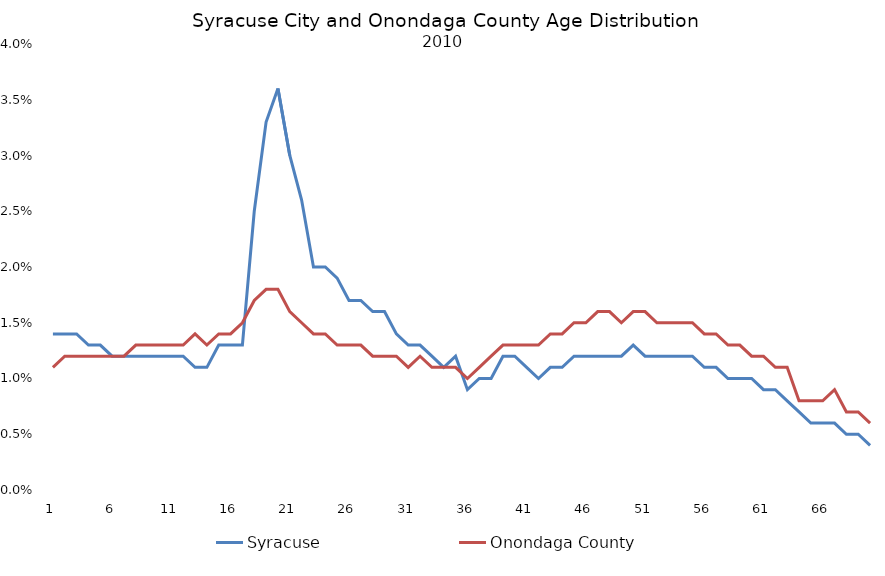
| Category | Syracuse | Onondaga County |
|---|---|---|
| 0 | 0.014 | 0.011 |
| 1 | 0.014 | 0.012 |
| 2 | 0.014 | 0.012 |
| 3 | 0.013 | 0.012 |
| 4 | 0.013 | 0.012 |
| 5 | 0.012 | 0.012 |
| 6 | 0.012 | 0.012 |
| 7 | 0.012 | 0.013 |
| 8 | 0.012 | 0.013 |
| 9 | 0.012 | 0.013 |
| 10 | 0.012 | 0.013 |
| 11 | 0.012 | 0.013 |
| 12 | 0.011 | 0.014 |
| 13 | 0.011 | 0.013 |
| 14 | 0.013 | 0.014 |
| 15 | 0.013 | 0.014 |
| 16 | 0.013 | 0.015 |
| 17 | 0.025 | 0.017 |
| 18 | 0.033 | 0.018 |
| 19 | 0.036 | 0.018 |
| 20 | 0.03 | 0.016 |
| 21 | 0.026 | 0.015 |
| 22 | 0.02 | 0.014 |
| 23 | 0.02 | 0.014 |
| 24 | 0.019 | 0.013 |
| 25 | 0.017 | 0.013 |
| 26 | 0.017 | 0.013 |
| 27 | 0.016 | 0.012 |
| 28 | 0.016 | 0.012 |
| 29 | 0.014 | 0.012 |
| 30 | 0.013 | 0.011 |
| 31 | 0.013 | 0.012 |
| 32 | 0.012 | 0.011 |
| 33 | 0.011 | 0.011 |
| 34 | 0.012 | 0.011 |
| 35 | 0.009 | 0.01 |
| 36 | 0.01 | 0.011 |
| 37 | 0.01 | 0.012 |
| 38 | 0.012 | 0.013 |
| 39 | 0.012 | 0.013 |
| 40 | 0.011 | 0.013 |
| 41 | 0.01 | 0.013 |
| 42 | 0.011 | 0.014 |
| 43 | 0.011 | 0.014 |
| 44 | 0.012 | 0.015 |
| 45 | 0.012 | 0.015 |
| 46 | 0.012 | 0.016 |
| 47 | 0.012 | 0.016 |
| 48 | 0.012 | 0.015 |
| 49 | 0.013 | 0.016 |
| 50 | 0.012 | 0.016 |
| 51 | 0.012 | 0.015 |
| 52 | 0.012 | 0.015 |
| 53 | 0.012 | 0.015 |
| 54 | 0.012 | 0.015 |
| 55 | 0.011 | 0.014 |
| 56 | 0.011 | 0.014 |
| 57 | 0.01 | 0.013 |
| 58 | 0.01 | 0.013 |
| 59 | 0.01 | 0.012 |
| 60 | 0.009 | 0.012 |
| 61 | 0.009 | 0.011 |
| 62 | 0.008 | 0.011 |
| 63 | 0.007 | 0.008 |
| 64 | 0.006 | 0.008 |
| 65 | 0.006 | 0.008 |
| 66 | 0.006 | 0.009 |
| 67 | 0.005 | 0.007 |
| 68 | 0.005 | 0.007 |
| 69 | 0.004 | 0.006 |